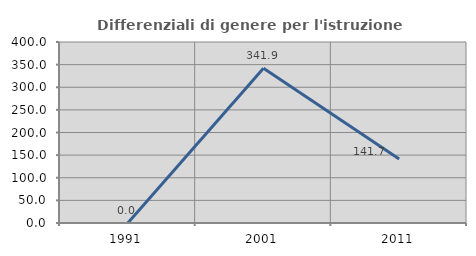
| Category | Differenziali di genere per l'istruzione superiore |
|---|---|
| 1991.0 | 0 |
| 2001.0 | 341.935 |
| 2011.0 | 141.667 |